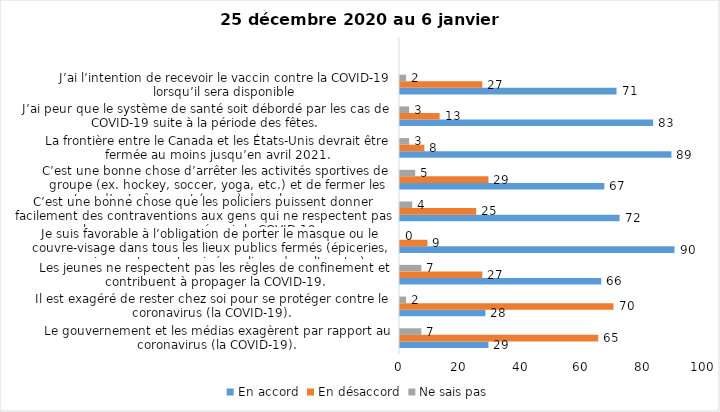
| Category | En accord | En désaccord | Ne sais pas |
|---|---|---|---|
| Le gouvernement et les médias exagèrent par rapport au coronavirus (la COVID-19). | 29 | 65 | 7 |
| Il est exagéré de rester chez soi pour se protéger contre le coronavirus (la COVID-19). | 28 | 70 | 2 |
| Les jeunes ne respectent pas les règles de confinement et contribuent à propager la COVID-19. | 66 | 27 | 7 |
| Je suis favorable à l’obligation de porter le masque ou le couvre-visage dans tous les lieux publics fermés (épiceries, magasins, restaurants, cinéma, lieux de culte, etc.). | 90 | 9 | 0 |
| C’est une bonne chose que les policiers puissent donner facilement des contraventions aux gens qui ne respectent pas les mesures pour prévenir la COVID-19. | 72 | 25 | 4 |
| C’est une bonne chose d’arrêter les activités sportives de groupe (ex. hockey, soccer, yoga, etc.) et de fermer les centres d’entraînement (gyms) dans les zones rouges. | 67 | 29 | 5 |
| La frontière entre le Canada et les États-Unis devrait être fermée au moins jusqu’en avril 2021. | 89 | 8 | 3 |
| J’ai peur que le système de santé soit débordé par les cas de COVID-19 suite à la période des fêtes. | 83 | 13 | 3 |
| J’ai l’intention de recevoir le vaccin contre la COVID-19 lorsqu’il sera disponible | 71 | 27 | 2 |